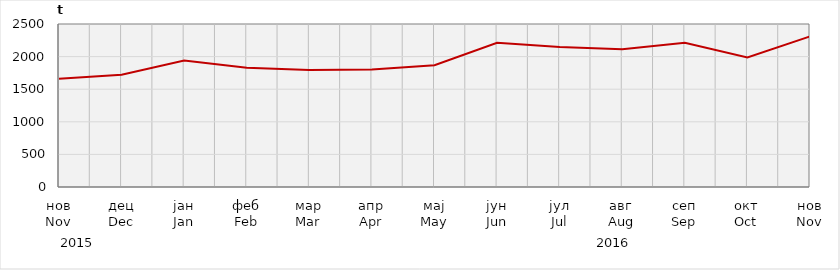
| Category | Нето тежина заклане стоке                              Net weight of  slaughtered livestock |
|---|---|
| нов
Nov | 1658700 |
| дец
Dec | 1721996.5 |
| јан
Jan | 1938649.7 |
| феб
Feb | 1828587.85 |
| мар
Mar | 1792740.7 |
| апр
Apr | 1800600 |
| мај
May | 1866665 |
| јун
Jun | 2210576.92 |
| јул
Jul | 2148617 |
| авг
Aug | 2114109.78 |
| сеп
Sep | 2211725.58 |
| окт
Oct | 1985741.43 |
| нов
Nov | 2309850.52 |